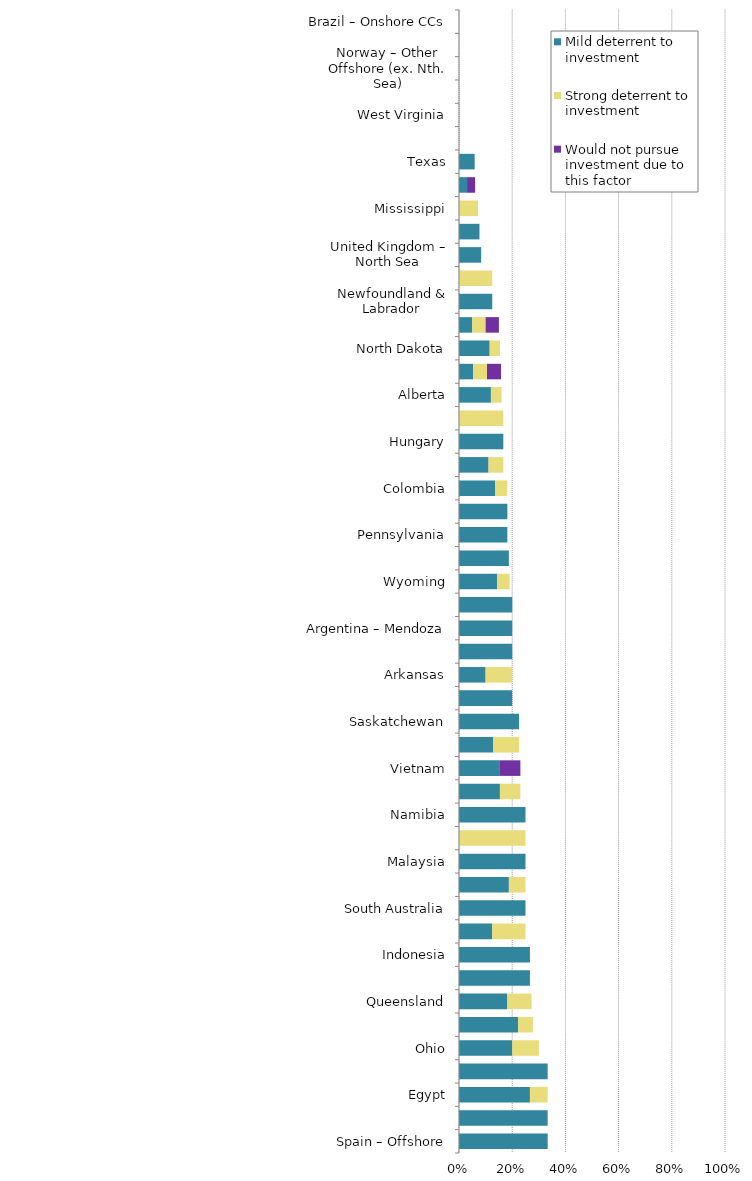
| Category | Mild deterrent to investment | Strong deterrent to investment | Would not pursue investment due to this factor |
|---|---|---|---|
| Spain – Offshore | 0.333 | 0 | 0 |
| South Africa | 0.333 | 0 | 0 |
| Egypt | 0.267 | 0.067 | 0 |
| Trinidad and Tobago | 0.333 | 0 | 0 |
| Ohio | 0.2 | 0.1 | 0 |
| Montana | 0.222 | 0.056 | 0 |
| Queensland | 0.182 | 0.091 | 0 |
| Manitoba | 0.267 | 0 | 0 |
| Indonesia | 0.267 | 0 | 0 |
| Alabama | 0.125 | 0.125 | 0 |
| South Australia | 0.25 | 0 | 0 |
| Australia – Offshore | 0.188 | 0.062 | 0 |
| Malaysia | 0.25 | 0 | 0 |
| France | 0 | 0.25 | 0 |
| Namibia | 0.25 | 0 | 0 |
| Colorado | 0.154 | 0.077 | 0 |
| Vietnam | 0.154 | 0 | 0.077 |
| British Columbia | 0.129 | 0.097 | 0 |
| Saskatchewan | 0.226 | 0 | 0 |
| Nova Scotia | 0.2 | 0 | 0 |
| Arkansas | 0.1 | 0.1 | 0 |
| Thailand | 0.2 | 0 | 0 |
| Argentina – Mendoza | 0.2 | 0 | 0 |
| Argentina – Santa Cruz | 0.2 | 0 | 0 |
| Wyoming | 0.143 | 0.048 | 0 |
| Kansas | 0.188 | 0 | 0 |
| Pennsylvania | 0.182 | 0 | 0 |
| New South Wales | 0.182 | 0 | 0 |
| Colombia | 0.136 | 0.045 | 0 |
| Western Australia | 0.111 | 0.056 | 0 |
| Hungary | 0.167 | 0 | 0 |
| Kazakhstan | 0 | 0.167 | 0 |
| Alberta | 0.12 | 0.04 | 0 |
| New Mexico | 0.053 | 0.053 | 0.053 |
| North Dakota | 0.115 | 0.038 | 0 |
| US Offshore – Gulf of Mexico | 0.05 | 0.05 | 0.05 |
| Newfoundland & Labrador | 0.125 | 0 | 0 |
| Utah | 0 | 0.125 | 0 |
| United Kingdom – North Sea | 0.083 | 0 | 0 |
| Norway – North Sea | 0.077 | 0 | 0 |
| Mississippi | 0 | 0.071 | 0 |
| Louisiana | 0.03 | 0 | 0.03 |
| Texas | 0.059 | 0 | 0 |
| Oklahoma | 0 | 0 | 0 |
| West Virginia | 0 | 0 | 0 |
| Netherlands | 0 | 0 | 0 |
| Norway – Other Offshore (ex. Nth. Sea) | 0 | 0 | 0 |
| UK – Other Offshore (ex. Nth. Sea) | 0 | 0 | 0 |
| Brazil – Onshore CCs | 0 | 0 | 0 |